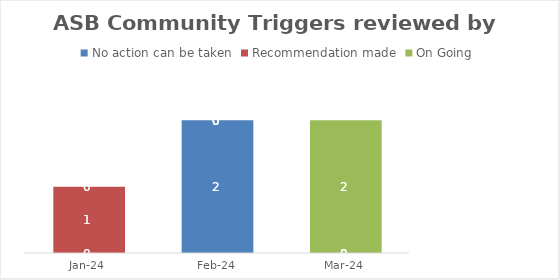
| Category | No action can be taken | Recommendation made | On Going |
|---|---|---|---|
| 2024-01-01 | 0 | 1 | 0 |
| 2024-02-01 | 2 | 0 | 0 |
| 2024-03-01 | 0 | 0 | 2 |